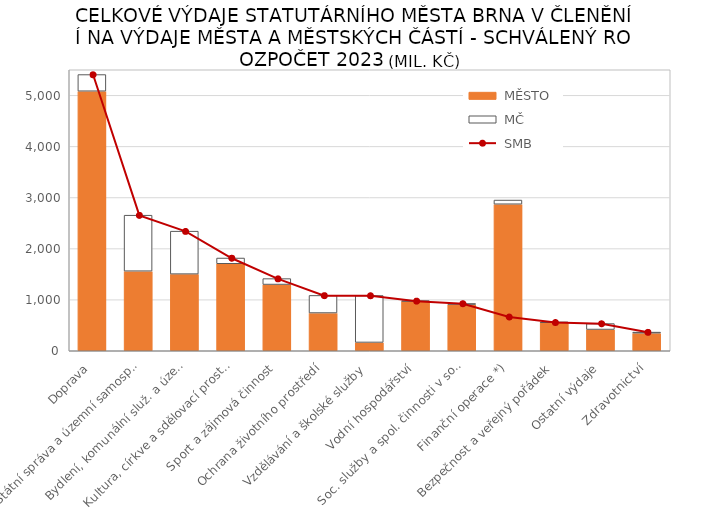
| Category |  MĚSTO |  MČ |
|---|---|---|
|  Doprava | 5080.082 | 326.201 |
|  Státní správa a územní samospráva | 1557.372 | 1096.232 |
|  Bydlení, komunální služ. a územ. rozvoj | 1499.843 | 841.056 |
|  Kultura, církve a sdělovací prostředky | 1702.822 | 112.272 |
|  Sport a zájmová činnost | 1296.054 | 116.387 |
|  Ochrana životního prostředí | 738.322 | 344.73 |
|  Vzdělávání a školské služby | 162.947 | 918.627 |
|  Vodní hospodářství | 969.081 | 6.686 |
|  Soc. služby a spol. činnosti v soc. zab. | 904.818 | 20.309 |
|  Finanční operace *) | 2867.798 | 81.935 |
|  Bezpečnost a veřejný pořádek | 556.044 | 1.615 |
|  Ostatní výdaje | 415.591 | 116.804 |
|  Zdravotnictví | 344.093 | 20.798 |